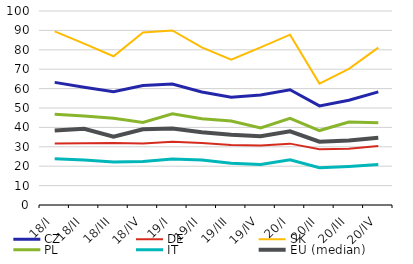
| Category | CZ | DE | SK | PL | IT | EU (median) |
|---|---|---|---|---|---|---|
| 18/I | 63.216 | 31.72 | 89.531 | 46.758 | 23.802 | 38.398 |
| 18/II | 60.663 | 31.869 | 83.181 | 45.902 | 23.244 | 39.329 |
| 18/III | 58.444 | 32.009 | 76.658 | 44.77 | 22.141 | 35.159 |
| 18/IV | 61.607 | 31.724 | 88.878 | 42.511 | 22.41 | 39.051 |
| 19/I | 62.361 | 32.666 | 89.992 | 47.004 | 23.659 | 39.474 |
| 19/II | 58.251 | 32.009 | 81.249 | 44.514 | 23.145 | 37.525 |
| 19/III | 55.506 | 30.874 | 74.911 | 43.264 | 21.507 | 36.183 |
| 19/IV | 56.679 | 30.708 | 81.283 | 39.695 | 20.896 | 35.492 |
| 20/I | 59.393 | 31.632 | 87.782 | 44.712 | 23.257 | 37.957 |
| 20/II | 51.071 | 28.766 | 62.579 | 38.37 | 19.235 | 32.613 |
| 20/III | 53.963 | 29.057 | 70.162 | 42.765 | 19.9 | 33.267 |
| 20/IV | 58.335 | 30.429 | 81.142 | 42.412 | 20.849 | 34.724 |